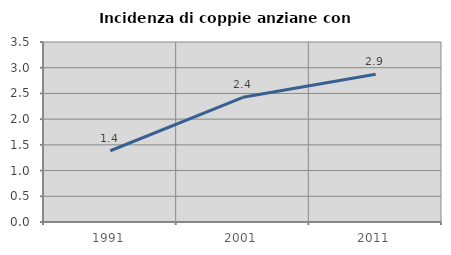
| Category | Incidenza di coppie anziane con figli |
|---|---|
| 1991.0 | 1.385 |
| 2001.0 | 2.424 |
| 2011.0 | 2.873 |